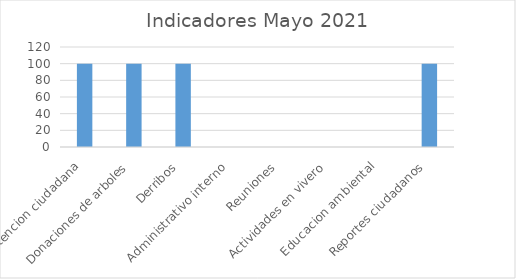
| Category | Series 0 |
|---|---|
| Atencion ciudadana  | 100 |
| Donaciones de arboles  | 100 |
| Derribos  | 100 |
| Administrativo interno  | 0 |
| Reuniones  | 0 |
| Actividades en vivero  | 0 |
| Educacion ambiental  | 0 |
| Reportes ciudadanos  | 100 |